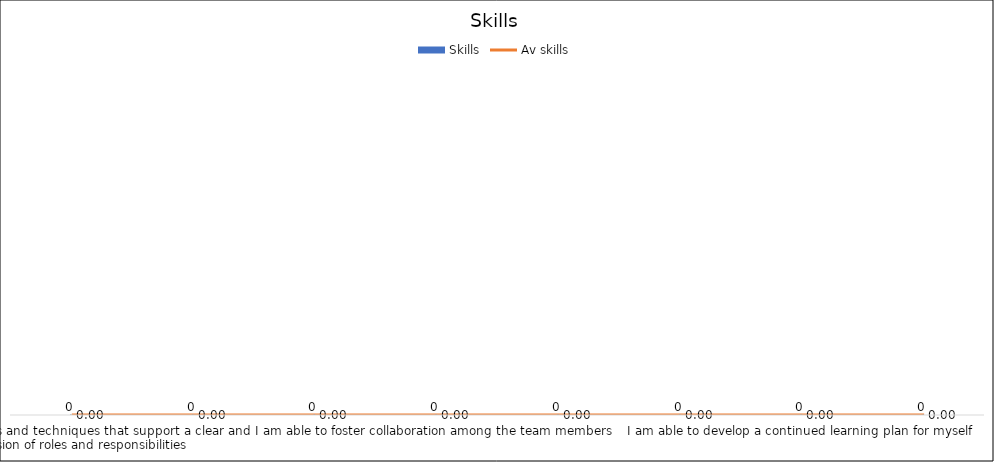
| Category | Skills |
|---|---|
| I master methods and techniques that support a clear and fair division of roles and responsibilities | 0 |
| I am able to contextualise and conceptualise teamwork practices with the principles of non-formal learning | 0 |
| I am able to match team members’ competences to the objectives of the activity and to the young peoples’ profiles | 0 |
| I am able to foster collaboration among the team members | 0 |
| I am able to deal well with crisis/conflicts in the team | 0 |
| I am able to work with various approaches, e.g. co-vision, supervision, collegial feedback, and cooperation | 0 |
| I am able to develop a continued learning plan for myself | 0 |
| I know how to deal with emotions | 0 |